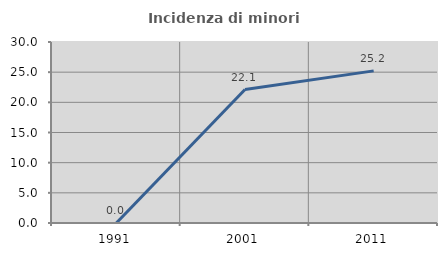
| Category | Incidenza di minori stranieri |
|---|---|
| 1991.0 | 0 |
| 2001.0 | 22.115 |
| 2011.0 | 25.212 |